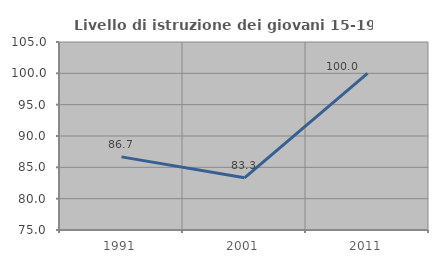
| Category | Livello di istruzione dei giovani 15-19 anni |
|---|---|
| 1991.0 | 86.667 |
| 2001.0 | 83.333 |
| 2011.0 | 100 |